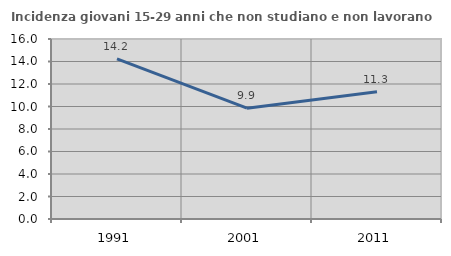
| Category | Incidenza giovani 15-29 anni che non studiano e non lavorano  |
|---|---|
| 1991.0 | 14.239 |
| 2001.0 | 9.852 |
| 2011.0 | 11.301 |